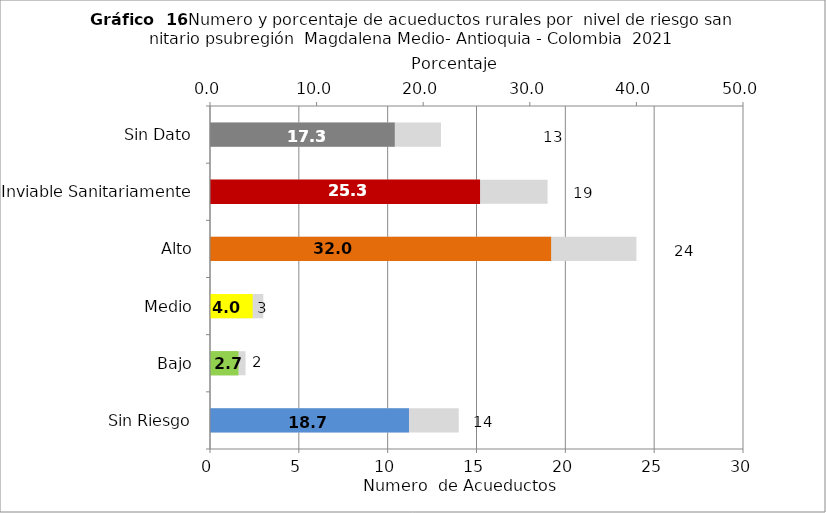
| Category | Número de Sistemas |
|---|---|
| Sin Riesgo | 14 |
| Bajo | 2 |
| Medio | 3 |
| Alto | 24 |
| Inviable Sanitariamente | 19 |
| Sin Dato | 13 |